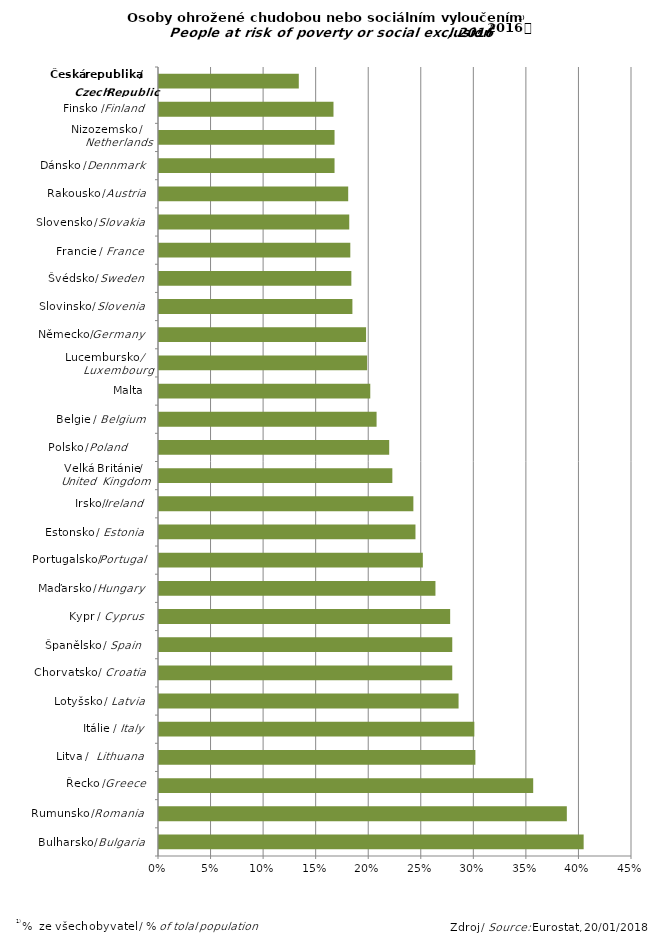
| Category | Series 0 |
|---|---|
|  | 0.404 |
|  | 0.388 |
|  | 0.356 |
|  | 0.301 |
|  | 0.3 |
|  | 0.285 |
|  | 0.279 |
|  | 0.279 |
|  | 0.277 |
|  | 0.263 |
|  | 0.251 |
|  | 0.244 |
|  | 0.242 |
|  | 0.222 |
|  | 0.219 |
|  | 0.207 |
|  | 0.201 |
|  | 0.198 |
|  | 0.197 |
|  | 0.184 |
|  | 0.183 |
|  | 0.182 |
|  | 0.181 |
|  | 0.18 |
|  | 0.167 |
|  | 0.167 |
|  | 0.166 |
|  | 0.133 |